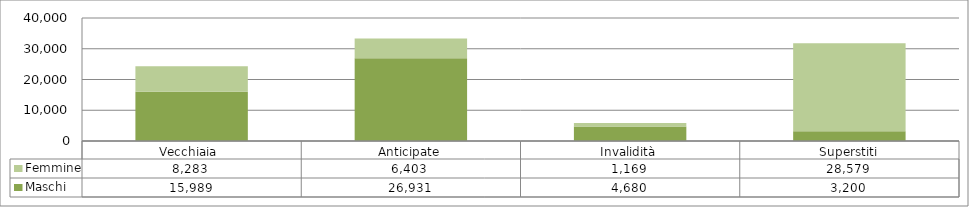
| Category | Maschi | Femmine |
|---|---|---|
| Vecchiaia  | 15989 | 8283 |
| Anticipate | 26931 | 6403 |
| Invalidità | 4680 | 1169 |
| Superstiti | 3200 | 28579 |